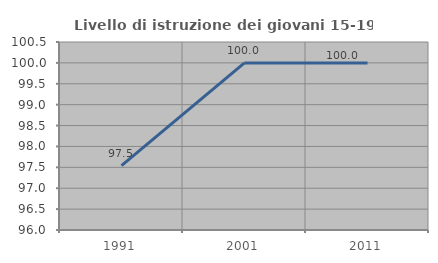
| Category | Livello di istruzione dei giovani 15-19 anni |
|---|---|
| 1991.0 | 97.541 |
| 2001.0 | 100 |
| 2011.0 | 100 |